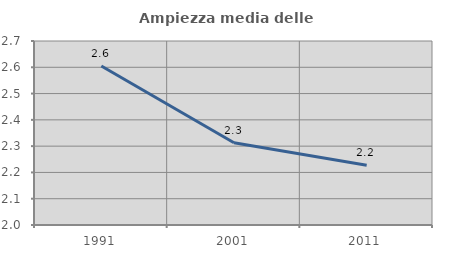
| Category | Ampiezza media delle famiglie |
|---|---|
| 1991.0 | 2.605 |
| 2001.0 | 2.313 |
| 2011.0 | 2.227 |